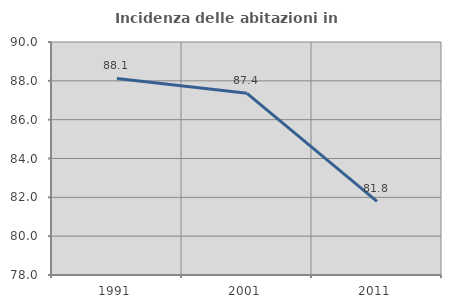
| Category | Incidenza delle abitazioni in proprietà  |
|---|---|
| 1991.0 | 88.125 |
| 2001.0 | 87.356 |
| 2011.0 | 81.791 |